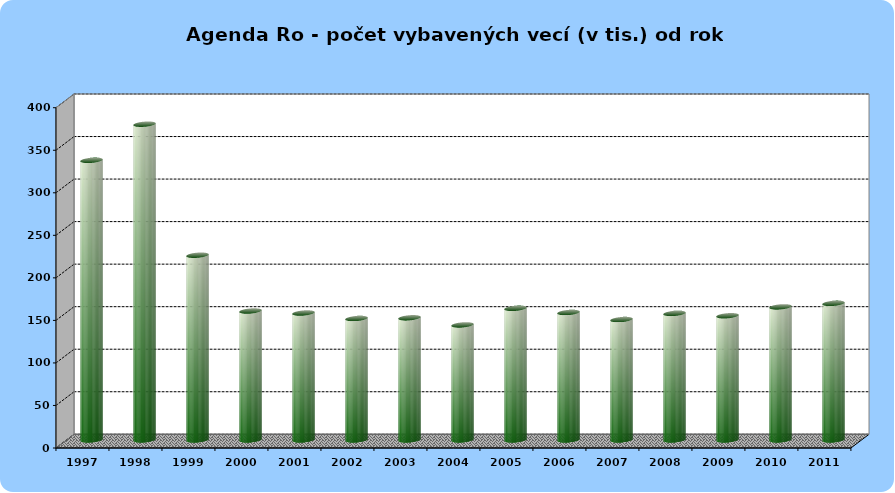
| Category | Počet vecí |
|---|---|
| 1997.0 | 328.75 |
| 1998.0 | 371.2 |
| 1999.0 | 217.2 |
| 2000.0 | 151.61 |
| 2001.0 | 149.27 |
| 2002.0 | 142.79 |
| 2003.0 | 143.65 |
| 2004.0 | 135.28 |
| 2005.0 | 154.78 |
| 2006.0 | 149.87 |
| 2007.0 | 141.56 |
| 2008.0 | 148.83 |
| 2009.0 | 146.04 |
| 2010.0 | 156.48 |
| 2011.0 | 160.63 |